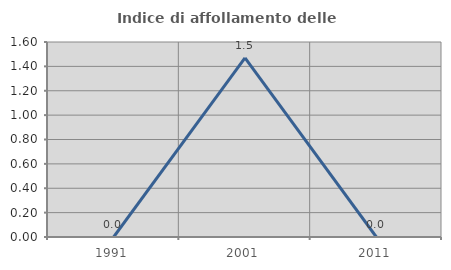
| Category | Indice di affollamento delle abitazioni  |
|---|---|
| 1991.0 | 0 |
| 2001.0 | 1.471 |
| 2011.0 | 0 |